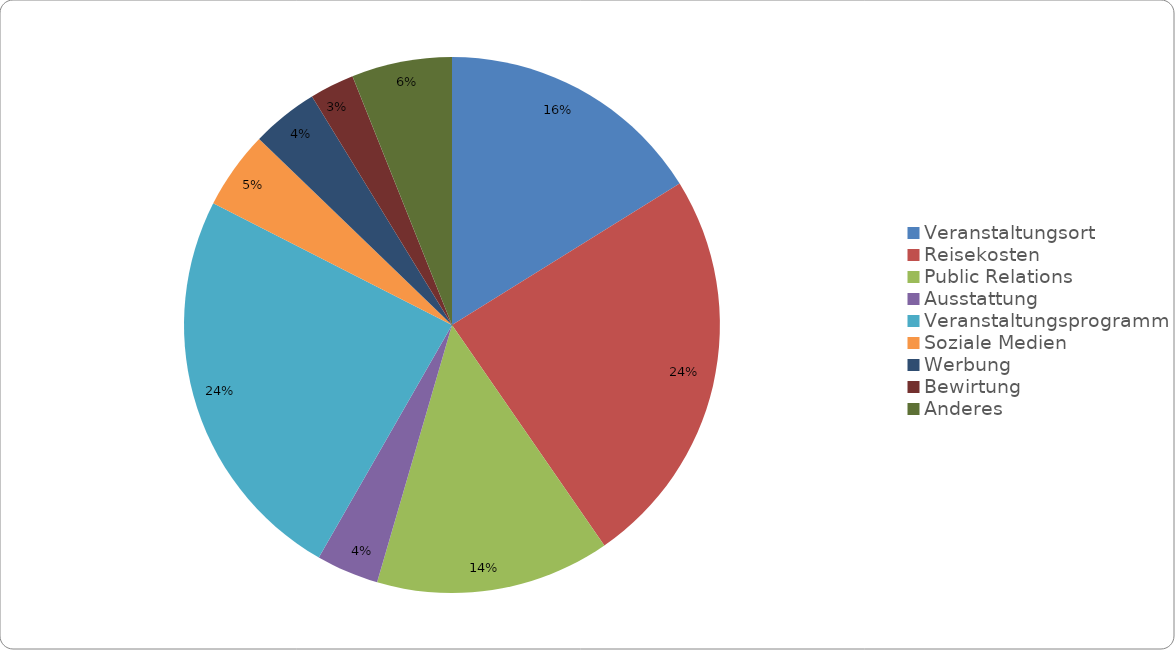
| Category | Series 0 |
|---|---|
| Veranstaltungsort | 1200 |
| Reisekosten | 1800 |
| Public Relations | 1050 |
| Ausstattung | 280 |
| Veranstaltungsprogramm | 1800 |
| Soziale Medien | 350 |
| Werbung | 300 |
| Bewirtung | 200 |
| Anderes | 450 |